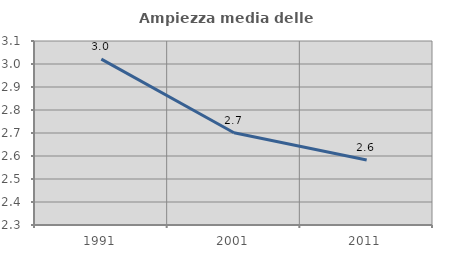
| Category | Ampiezza media delle famiglie |
|---|---|
| 1991.0 | 3.021 |
| 2001.0 | 2.701 |
| 2011.0 | 2.582 |